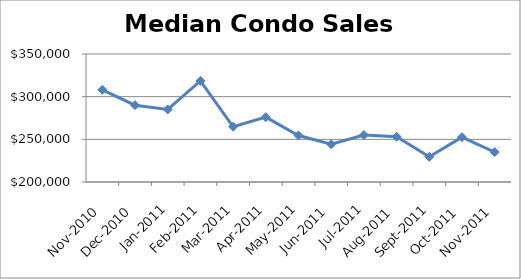
| Category | Series 0 |
|---|---|
| 2010-11-01 | 308000 |
| 2010-12-01 | 290000 |
| 2011-01-01 | 285000 |
| 2011-02-01 | 318500 |
| 2011-03-01 | 264750 |
| 2011-04-01 | 276000 |
| 2011-05-01 | 254500 |
| 2011-06-01 | 244250 |
| 2011-07-01 | 255000 |
| 2011-08-01 | 253000 |
| 2011-09-01 | 229475 |
| 2011-10-01 | 252500 |
| 2011-11-01 | 235000 |